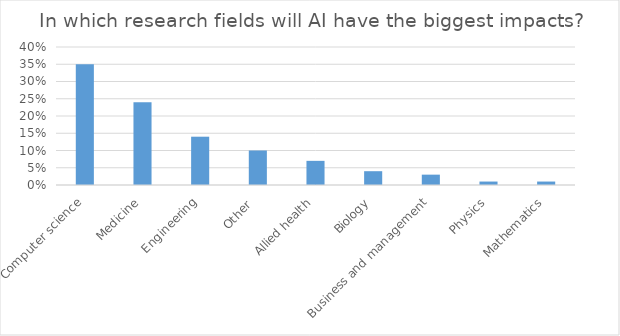
| Category | Series 0 |
|---|---|
|  Computer science | 0.35 |
|  Medicine | 0.24 |
|  Engineering | 0.14 |
|  Other  | 0.1 |
|  Allied health | 0.07 |
|  Biology | 0.04 |
|  Business and management | 0.03 |
|  Physics | 0.01 |
|  Mathematics | 0.01 |